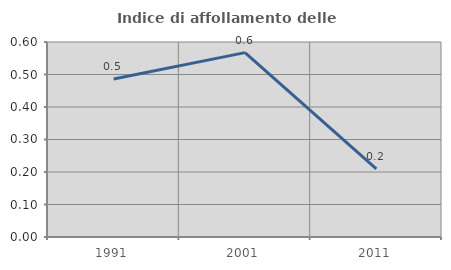
| Category | Indice di affollamento delle abitazioni  |
|---|---|
| 1991.0 | 0.486 |
| 2001.0 | 0.567 |
| 2011.0 | 0.21 |